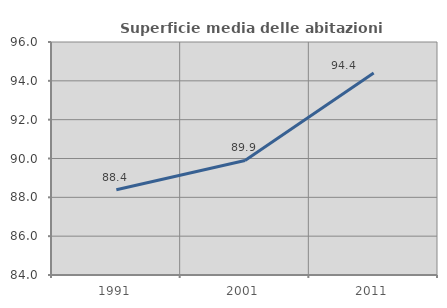
| Category | Superficie media delle abitazioni occupate |
|---|---|
| 1991.0 | 88.39 |
| 2001.0 | 89.901 |
| 2011.0 | 94.399 |